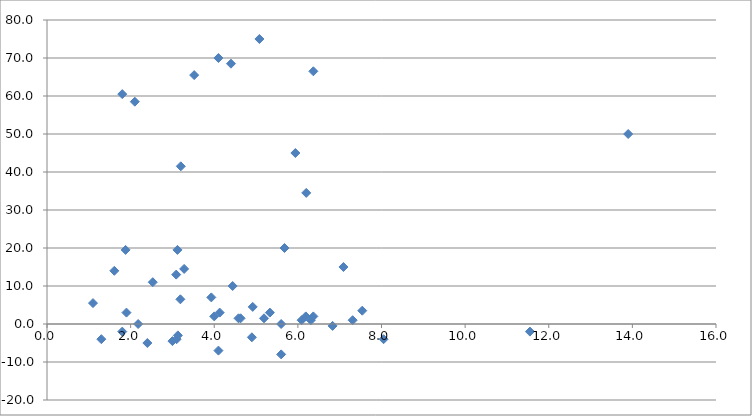
| Category | Series 0 |
|---|---|
| 7.54 | 3.5 |
| 4.1 | -7 |
| 5.6 | -8 |
| 6.3100000000000005 | 1 |
| 5.08 | 75 |
| 3.2800000000000002 | 14.5 |
| 4.1 | 70 |
| 13.9 | 50 |
| 6.2 | 34.5 |
| 5.33 | 3 |
| 6.19 | 2 |
| 2.1 | 58.5 |
| 2.18 | 0 |
| 5.9399999999999995 | 45 |
| 4.92 | 4.5 |
| 1.61 | 14 |
| 3.1 | -4 |
| 4.9 | -3.5 |
| 11.55 | -2 |
| 1.9 | 3 |
| 6.37 | 66.5 |
| 1.8 | 60.5 |
| 7.09 | 15 |
| 1.8800000000000001 | 19.5 |
| 8.05 | -4 |
| 6.83 | -0.5 |
| 3.1300000000000003 | -3 |
| 3.19 | 6.5 |
| 4.63 | 1.5 |
| 1.1 | 5.5 |
| 4.4 | 68.5 |
| 5.6 | 0 |
| 3.52 | 65.5 |
| 5.19 | 1.5 |
| 4.0 | 2 |
| 4.4399999999999995 | 10 |
| 6.09 | 1 |
| 2.53 | 11 |
| 5.680000000000001 | 20 |
| 3.2 | 41.5 |
| 7.3100000000000005 | 1 |
| 3.0 | -4.5 |
| 6.37 | 2 |
| 4.58 | 1.5 |
| 1.8 | -2 |
| 1.3 | -4 |
| 3.9299999999999997 | 7 |
| 3.12 | 19.5 |
| 4.13 | 3 |
| 3.09 | 13 |
| 2.4 | -5 |